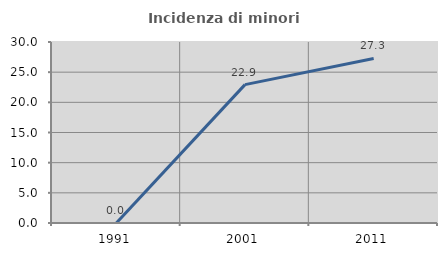
| Category | Incidenza di minori stranieri |
|---|---|
| 1991.0 | 0 |
| 2001.0 | 22.936 |
| 2011.0 | 27.273 |